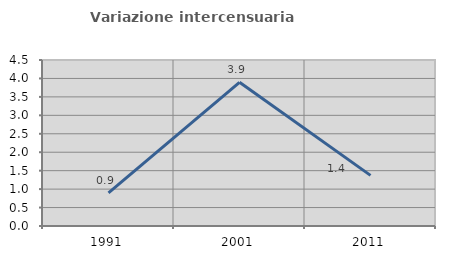
| Category | Variazione intercensuaria annua |
|---|---|
| 1991.0 | 0.896 |
| 2001.0 | 3.894 |
| 2011.0 | 1.372 |